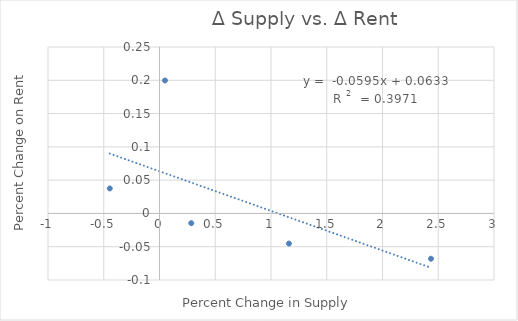
| Category | Series 0 |
|---|---|
| 2.4347826086956523 | -0.068 |
| 0.28481012658227844 | -0.015 |
| 0.049261083743842304 | 0.2 |
| -0.4460093896713615 | 0.037 |
| 1.1610169491525424 | -0.045 |